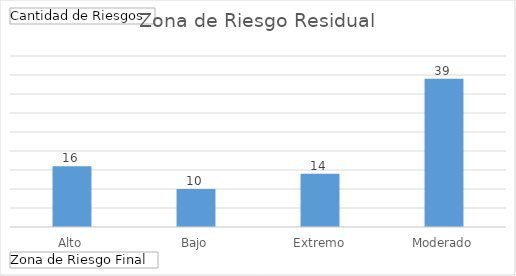
| Category | Total |
|---|---|
| Alto | 16 |
| Bajo | 10 |
| Extremo | 14 |
| Moderado | 39 |